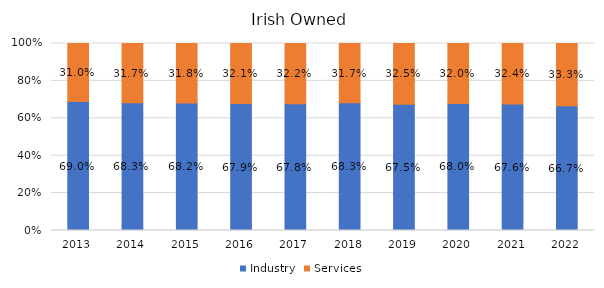
| Category | Industry | Services |
|---|---|---|
| 2013.0 | 0.69 | 0.31 |
| 2014.0 | 0.683 | 0.317 |
| 2015.0 | 0.682 | 0.318 |
| 2016.0 | 0.679 | 0.321 |
| 2017.0 | 0.678 | 0.322 |
| 2018.0 | 0.683 | 0.317 |
| 2019.0 | 0.675 | 0.325 |
| 2020.0 | 0.68 | 0.32 |
| 2021.0 | 0.676 | 0.324 |
| 2022.0 | 0.667 | 0.333 |